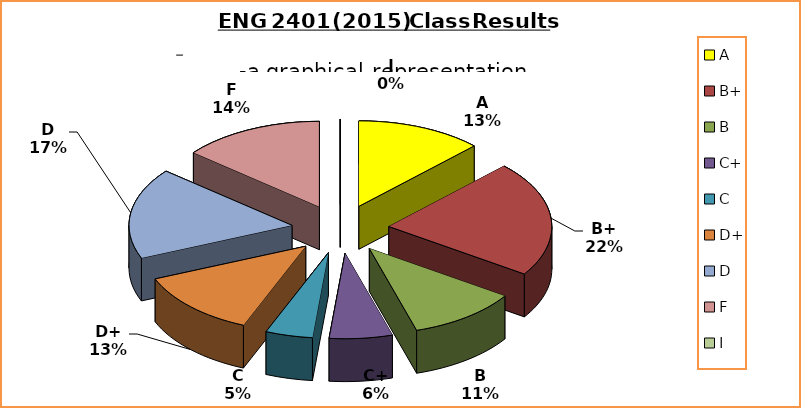
| Category | Series 0 |
|---|---|
| A | 8 |
| B+ | 14 |
| B | 7 |
| C+ | 4 |
| C | 3 |
| D+ | 8 |
| D | 11 |
| F | 9 |
| I | 0 |